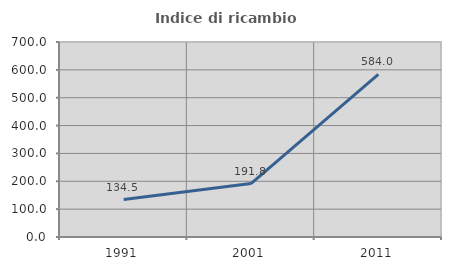
| Category | Indice di ricambio occupazionale  |
|---|---|
| 1991.0 | 134.483 |
| 2001.0 | 191.837 |
| 2011.0 | 584 |